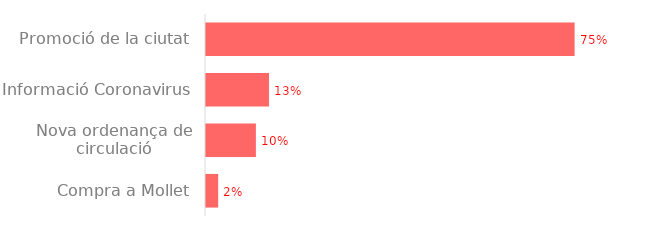
| Category | Series 0 |
|---|---|
| Promoció de la ciutat | 14178.14 |
| Informació Coronavirus | 2423.5 |
| Nova ordenança de circulació | 1919.06 |
| Compra a Mollet | 468.27 |